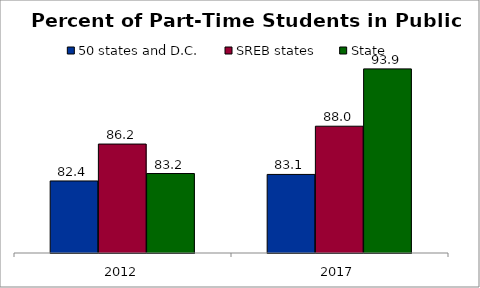
| Category | 50 states and D.C. | SREB states | State |
|---|---|---|---|
| 2012 | 82.389 | 86.175 | 83.151 |
| 2017 | 83.059 | 88.005 | 93.885 |